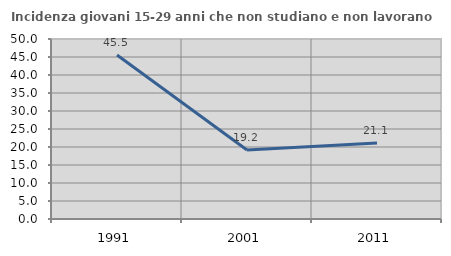
| Category | Incidenza giovani 15-29 anni che non studiano e non lavorano  |
|---|---|
| 1991.0 | 45.532 |
| 2001.0 | 19.178 |
| 2011.0 | 21.123 |